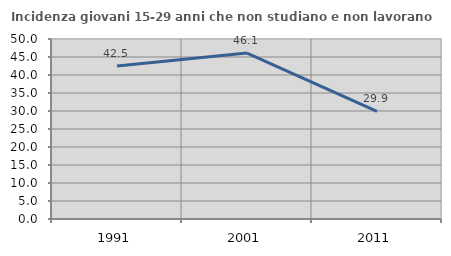
| Category | Incidenza giovani 15-29 anni che non studiano e non lavorano  |
|---|---|
| 1991.0 | 42.497 |
| 2001.0 | 46.097 |
| 2011.0 | 29.864 |